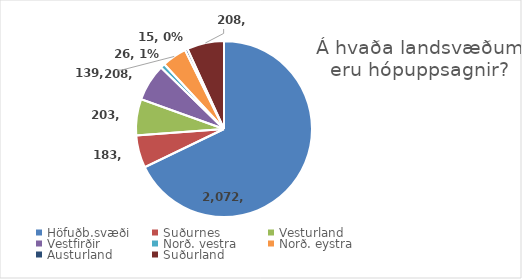
| Category | Series 0 |
|---|---|
| Höfuðb.svæði | 2072 |
| Suðurnes | 183 |
| Vesturland | 203 |
| Vestfirðir | 208 |
| Norð. vestra | 26 |
| Norð. eystra | 139 |
| Austurland | 15 |
| Suðurland | 208 |